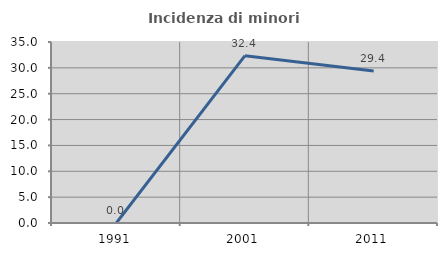
| Category | Incidenza di minori stranieri |
|---|---|
| 1991.0 | 0 |
| 2001.0 | 32.353 |
| 2011.0 | 29.412 |